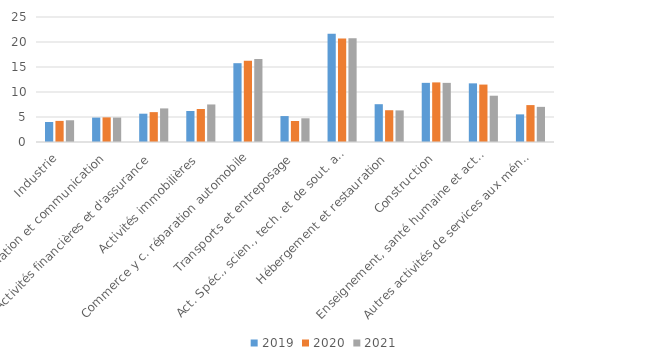
| Category | 2019 | 2020 | 2021 |
|---|---|---|---|
| Industrie | 4 | 4.221 | 4.347 |
| Information et communication | 4.881 | 4.926 | 4.883 |
| Activités financières et d'assurance | 5.661 | 5.974 | 6.717 |
| Activités immobilières | 6.203 | 6.596 | 7.508 |
| Commerce y c. réparation automobile | 15.763 | 16.25 | 16.596 |
| Transports et entreposage | 5.186 | 4.202 | 4.742 |
| Act. Spéc., scien., tech. et de sout. aux ent. | 21.661 | 20.69 | 20.773 |
| Hébergement et restauration | 7.559 | 6.355 | 6.322 |
| Construction | 11.831 | 11.92 | 11.826 |
| Enseignement, santé humaine et action sociale | 11.729 | 11.485 | 9.258 |
| Autres activités de services aux ménages | 5.525 | 7.38 | 7.028 |